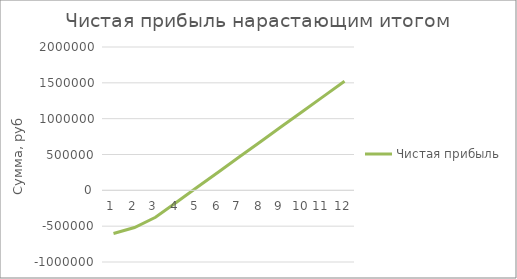
| Category | Чистая прибыль |
|---|---|
| 0 | -601631.667 |
| 1 | -519158.733 |
| 2 | -375910.6 |
| 3 | -165009.267 |
| 4 | 45892.067 |
| 5 | 256793.4 |
| 6 | 467694.733 |
| 7 | 678596.067 |
| 8 | 889497.4 |
| 9 | 1100398.733 |
| 10 | 1311300.067 |
| 11 | 1522201.4 |